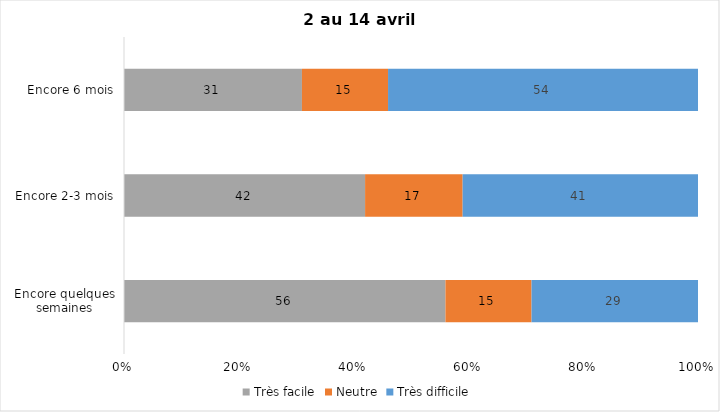
| Category | Très facile | Neutre | Très difficile |
|---|---|---|---|
| Encore quelques semaines | 56 | 15 | 29 |
| Encore 2-3 mois | 42 | 17 | 41 |
| Encore 6 mois | 31 | 15 | 54 |